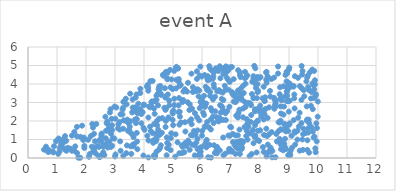
| Category | Series 0 |
|---|---|
| 6.514540313641692 | 0.25 |
| 3.258036223303853 | 2.355 |
| 9.611685176595932 | 2.788 |
| 6.718119250185469 | 2.056 |
| 3.560900860458809 | 0.226 |
| 9.434667183937016 | 4.973 |
| 9.293604395264447 | 1.469 |
| 2.3106375163464357 | 0.904 |
| 9.527382701474306 | 3.335 |
| 8.726764199824812 | 0.893 |
| 5.825327841776408 | 4.685 |
| 1000.0 | 1000 |
| 1000.0 | 1000 |
| 1000.0 | 1000 |
| 2.7900266712365154 | 1.78 |
| 7.911885719242525 | 3.995 |
| 5.846657293763941 | 3.717 |
| 7.2453509117797 | 2.362 |
| 2.072651007675997 | 0.986 |
| 7.290248872529956 | 2.613 |
| 3.8726823225385285 | 2.642 |
| 1000.0 | 1000 |
| 4.938799020726297 | 1.337 |
| 1.2728139878986489 | 0.508 |
| 7.4158468451568815 | 2.201 |
| 1000.0 | 1000 |
| 9.66142939396353 | 1.606 |
| 9.600120747328019 | 4.144 |
| 4.246755495161998 | 2.842 |
| 4.922787181447119 | 1.071 |
| 4.590618096940318 | 3.41 |
| 6.416403614070068 | 3.818 |
| 5.556336335870954 | 0.84 |
| 1000.0 | 1000 |
| 1000.0 | 1000 |
| 1000.0 | 1000 |
| 1000.0 | 1000 |
| 9.04494552154286 | 0.16 |
| 4.452664086378109 | 1.772 |
| 6.681659004231962 | 3.192 |
| 5.825778668973726 | 4.275 |
| 6.379328122886779 | 3.17 |
| 1000.0 | 1000 |
| 0.6876049098019399 | 0.331 |
| 1000.0 | 1000 |
| 3.871232251648208 | 3.512 |
| 1000.0 | 1000 |
| 3.775248777607053 | 2.42 |
| 4.660409793697826 | 4.506 |
| 1000.0 | 1000 |
| 1000.0 | 1000 |
| 7.1762036709917805 | 0.581 |
| 2.9810257942731 | 1.051 |
| 1000.0 | 1000 |
| 5.003178958912086 | 1.778 |
| 7.9161145641658335 | 1.989 |
| 5.619706045245647 | 1.236 |
| 1000.0 | 1000 |
| 8.925193801852668 | 3.833 |
| 1000.0 | 1000 |
| 5.013668524437431 | 2.569 |
| 1000.0 | 1000 |
| 7.758082436355092 | 1.512 |
| 1000.0 | 1000 |
| 3.541358059265891 | 0.631 |
| 7.892898900187163 | 3.235 |
| 1000.0 | 1000 |
| 8.896641847217783 | 0.48 |
| 3.9532553654040594 | 2.474 |
| 6.966066409401218 | 1.207 |
| 1000.0 | 1000 |
| 6.808218139456765 | 0.241 |
| 9.623420101642365 | 2.072 |
| 4.429543796718467 | 3.363 |
| 1000.0 | 1000 |
| 8.871622594810644 | 3.341 |
| 1000.0 | 1000 |
| 8.632051306754953 | 1.442 |
| 7.502352511373928 | 2.76 |
| 1000.0 | 1000 |
| 6.634056661532679 | 4.312 |
| 1000.0 | 1000 |
| 3.740877927754135 | 3.434 |
| 5.686220917137559 | 3.568 |
| 3.3809819670199937 | 2.001 |
| 9.8960376760196 | 3.979 |
| 1000.0 | 1000 |
| 8.228029484336398 | 0.088 |
| 1000.0 | 1000 |
| 5.685380858201006 | 3.83 |
| 2.1715633291461134 | 1.191 |
| 7.654770253525554 | 1.328 |
| 8.399872269272793 | 1.399 |
| 1000.0 | 1000 |
| 1000.0 | 1000 |
| 1.0608959885048153 | 1.024 |
| 6.711718383214096 | 3.533 |
| 2.454232472207053 | 0.958 |
| 1000.0 | 1000 |
| 1000.0 | 1000 |
| 6.588337880781211 | 3.66 |
| 3.653043263124766 | 0.73 |
| 9.686106286316482 | 3.676 |
| 8.85359167712618 | 1.797 |
| 1.9267528540206402 | 1.105 |
| 1000.0 | 1000 |
| 5.359114226030945 | 3.595 |
| 1000.0 | 1000 |
| 3.4679052299274113 | 1.873 |
| 6.1043733892131415 | 2.766 |
| 8.561822941673391 | 1.297 |
| 5.414003402297297 | 0.806 |
| 6.712299307437418 | 4.796 |
| 6.810480057490162 | 4.584 |
| 8.683702296176923 | 1.918 |
| 2.626913685242187 | 0.688 |
| 1000.0 | 1000 |
| 8.12736722713076 | 3.852 |
| 1000.0 | 1000 |
| 5.045221637019969 | 3.201 |
| 7.7156233174318825 | 0.215 |
| 5.240193843390656 | 2.237 |
| 9.691128857250453 | 0.289 |
| 2.6246427155748844 | 0.709 |
| 5.506216551615943 | 3.014 |
| 5.848012588612992 | 0.477 |
| 1000.0 | 1000 |
| 4.559511935105263 | 3.897 |
| 7.036706938964193 | 3.558 |
| 7.130024140764714 | 0.681 |
| 6.943980034351408 | 2.769 |
| 8.483028087952224 | 3.253 |
| 1000.0 | 1000 |
| 1000.0 | 1000 |
| 7.4375483032000735 | 3.512 |
| 8.507203204080842 | 3.145 |
| 1.3291151319703531 | 0.392 |
| 2.531101460166074 | 0.89 |
| 9.290065904599496 | 0.994 |
| 8.864440213556103 | 1.036 |
| 7.967733605172224 | 2.673 |
| 7.182201013032082 | 2.29 |
| 9.659340068282848 | 3.835 |
| 1000.0 | 1000 |
| 9.848716116556968 | 1.103 |
| 5.218818625873767 | 0.256 |
| 3.6867273387000665 | 2.078 |
| 1000.0 | 1000 |
| 7.465627525975101 | 1.674 |
| 1000.0 | 1000 |
| 2.129740435931937 | 0.217 |
| 8.998576381001227 | 4.791 |
| 4.867270504674572 | 3.106 |
| 2.983964614326701 | 2.781 |
| 7.093316455840945 | 4.264 |
| 6.3464652420747765 | 2.548 |
| 9.202016896984315 | 4.42 |
| 6.895471794531911 | 4.239 |
| 6.264222998689867 | 0.707 |
| 1000.0 | 1000 |
| 4.82044853488968 | 4.284 |
| 1.8028459880965542 | 0.014 |
| 7.85060531830029 | 4.259 |
| 4.3543954767927655 | 3.08 |
| 7.063594628770513 | 1.299 |
| 1000.0 | 1000 |
| 1000.0 | 1000 |
| 4.147813707292426 | 3.636 |
| 2.4776869820574277 | 0.047 |
| 5.806915966917377 | 0.843 |
| 9.823055023263779 | 1.429 |
| 8.936965084795968 | 4.582 |
| 4.380535839575199 | 0.068 |
| 1000.0 | 1000 |
| 7.914297933571 | 3.554 |
| 6.212698852102766 | 0.043 |
| 4.236206944368406 | 1.456 |
| 3.188035578879046 | 2.36 |
| 1000.0 | 1000 |
| 1000.0 | 1000 |
| 7.968309888299755 | 0.92 |
| 1000.0 | 1000 |
| 4.551455021510849 | 0.545 |
| 1000.0 | 1000 |
| 5.93566228334256 | 0.555 |
| 3.6305060942906775 | 0.738 |
| 7.5685874340832395 | 0.99 |
| 8.282125300683639 | 0.318 |
| 5.080129334359851 | 0.069 |
| 8.22695800207018 | 4.066 |
| 1000.0 | 1000 |
| 5.1900322604879765 | 2.839 |
| 9.183193680717087 | 3.431 |
| 5.044480115368461 | 2.855 |
| 2.8992486127065775 | 1.509 |
| 1.5979403462377006 | 0.397 |
| 1000.0 | 1000 |
| 1000.0 | 1000 |
| 7.030300307435878 | 4.919 |
| 5.776724905912203 | 1.266 |
| 4.680318558717148 | 4.443 |
| 1000.0 | 1000 |
| 1.0430371045711961 | 0.225 |
| 3.8637399333534272 | 2.529 |
| 3.6200438204071617 | 2.524 |
| 6.163536174882916 | 0.979 |
| 0.7144950208958001 | 0.436 |
| 9.625427176227253 | 4.348 |
| 6.41934125486266 | 4.649 |
| 1000.0 | 1000 |
| 5.485324604742309 | 3.588 |
| 1000.0 | 1000 |
| 6.823739761555845 | 4.953 |
| 6.719900862978956 | 2.555 |
| 6.399390012197944 | 1.888 |
| 1000.0 | 1000 |
| 4.41154532265295 | 0.905 |
| 6.391364944535076 | 4.423 |
| 5.955075213295808 | 0.116 |
| 9.02473897776195 | 0.224 |
| 1000.0 | 1000 |
| 8.137386755633694 | 2.599 |
| 5.9567739569855895 | 0.341 |
| 1000.0 | 1000 |
| 1000.0 | 1000 |
| 6.270906933123551 | 4.242 |
| 5.845889803515922 | 1.494 |
| 8.241404398006035 | 1.191 |
| 9.95508216872793 | 0.897 |
| 1000.0 | 1000 |
| 7.095664108203753 | 3.046 |
| 1000.0 | 1000 |
| 2.6688865298084496 | 2.229 |
| 6.543294061614979 | 0.499 |
| 4.7025456202294835 | 2.718 |
| 5.301733448824302 | 0.682 |
| 7.247550160782171 | 4.747 |
| 7.545310348943461 | 2.097 |
| 7.307451780532784 | 0.218 |
| 7.332142571232993 | 4.371 |
| 1000.0 | 1000 |
| 6.143240497960162 | 2.944 |
| 0.8967386409265554 | 0.636 |
| 1000.0 | 1000 |
| 7.664707222498533 | 2.956 |
| 1000.0 | 1000 |
| 6.74054164617933 | 0.146 |
| 1000.0 | 1000 |
| 3.71327616995225 | 2.745 |
| 1000.0 | 1000 |
| 9.663890006803909 | 1.373 |
| 6.459865381903898 | 2.526 |
| 3.762144668001416 | 0.885 |
| 3.996319309304331 | 2.882 |
| 8.711038210874376 | 2.017 |
| 3.017206831126984 | 0.191 |
| 9.486145207419945 | 1.288 |
| 4.367661746456171 | 2.389 |
| 1000.0 | 1000 |
| 4.798404682042131 | 0.538 |
| 7.860147931615403 | 1.915 |
| 6.3816719039158905 | 2.241 |
| 4.877253682173817 | 2.851 |
| 2.33862078462149 | 0.24 |
| 3.724900766705128 | 2.085 |
| 6.2735918978225405 | 4.832 |
| 5.910648101177124 | 0.074 |
| 9.93043456170236 | 3.444 |
| 1000.0 | 1000 |
| 9.820999612242465 | 2.643 |
| 5.830470793768743 | 2.202 |
| 1000.0 | 1000 |
| 1000.0 | 1000 |
| 1000.0 | 1000 |
| 7.15447996717555 | 0.226 |
| 5.159745400582453 | 4.833 |
| 2.6915173147839666 | 1.474 |
| 1000.0 | 1000 |
| 8.34470673158056 | 3.625 |
| 6.94182275503053 | 0.347 |
| 4.821484832978177 | 3.435 |
| 5.523232727882823 | 0.945 |
| 9.893856861453509 | 4.202 |
| 5.208489437091116 | 3.242 |
| 1.2806991897897213 | 0.448 |
| 8.224242214543965 | 4.657 |
| 8.64163376453481 | 1.934 |
| 6.038383613097386 | 2.453 |
| 7.7927000005170335 | 4.23 |
| 1.150259706234692 | 0.75 |
| 1000.0 | 1000 |
| 4.302377585368769 | 1.344 |
| 6.631966731170321 | 3.592 |
| 9.679259066702755 | 2.075 |
| 1000.0 | 1000 |
| 3.7229447155647954 | 1.885 |
| 8.367000429181433 | 0.56 |
| 5.3321003032338705 | 0.599 |
| 1000.0 | 1000 |
| 7.332485757335206 | 0.931 |
| 5.7188539551587105 | 1.453 |
| 6.474273480099159 | 4.844 |
| 1000.0 | 1000 |
| 1000.0 | 1000 |
| 1000.0 | 1000 |
| 5.750110339120952 | 0.692 |
| 6.976334313948312 | 0.454 |
| 7.371194537192962 | 3.439 |
| 1000.0 | 1000 |
| 8.852529477733437 | 1.84 |
| 3.410123841095598 | 0.68 |
| 6.954289928328272 | 4.111 |
| 1000.0 | 1000 |
| 7.855765397749956 | 4.257 |
| 5.643888866368334 | 1.824 |
| 9.990744768019354 | 2.231 |
| 1.5128956668273696 | 1.208 |
| 1000.0 | 1000 |
| 1000.0 | 1000 |
| 5.921630233792862 | 2.695 |
| 1000.0 | 1000 |
| 1000.0 | 1000 |
| 4.484015765399862 | 2.846 |
| 1000.0 | 1000 |
| 7.776164515706685 | 0.798 |
| 9.19151780647466 | 1.434 |
| 1000.0 | 1000 |
| 4.801627071903875 | 0.823 |
| 9.848113686434678 | 3.927 |
| 9.632829366969023 | 0.435 |
| 9.193343354852173 | 2.681 |
| 4.545725821500337 | 1.291 |
| 9.36594439407828 | 2.445 |
| 5.266191773828888 | 3.949 |
| 7.838992140334514 | 1.197 |
| 1000.0 | 1000 |
| 9.61789981577809 | 2.019 |
| 8.261439886375273 | 4.416 |
| 7.802275845440008 | 4.978 |
| 8.810940513478846 | 2.344 |
| 1000.0 | 1000 |
| 1000.0 | 1000 |
| 5.8448672464615115 | 1.037 |
| 3.6238560780121643 | 0.637 |
| 8.83875381340874 | 0.773 |
| 4.911861901838694 | 3.816 |
| 3.4019592583251033 | 2.901 |
| 5.1930736472680685 | 2.48 |
| 1000.0 | 1000 |
| 8.003325289158044 | 2.466 |
| 1000.0 | 1000 |
| 5.222423120304373 | 3.892 |
| 4.3803315809945715 | 3.074 |
| 1000.0 | 1000 |
| 1000.0 | 1000 |
| 9.00954510703923 | 1.805 |
| 1000.0 | 1000 |
| 1000.0 | 1000 |
| 7.478890724353494 | 3.027 |
| 5.197220392025122 | 4.268 |
| 7.882079933877385 | 0.3 |
| 4.785195511697403 | 1.115 |
| 8.229990341659354 | 4.204 |
| 9.481755710453035 | 0.436 |
| 1000.0 | 1000 |
| 4.155163877615523 | 0.947 |
| 5.985117269969175 | 2.812 |
| 1000.0 | 1000 |
| 1000.0 | 1000 |
| 5.794371801498438 | 3.613 |
| 1000.0 | 1000 |
| 5.100461762520299 | 4.887 |
| 5.517294853772071 | 4.066 |
| 8.62337746160611 | 4.568 |
| 1000.0 | 1000 |
| 9.993747789134206 | 3.054 |
| 4.451363117371424 | 1.339 |
| 1.8653586643806797 | 1.746 |
| 1000.0 | 1000 |
| 1.597530083334503 | 1.411 |
| 2.9247422389931224 | 1.069 |
| 3.8044481382731243 | 2.935 |
| 1000.0 | 1000 |
| 2.8454326378790995 | 2.635 |
| 1000.0 | 1000 |
| 6.391924342224485 | 4.656 |
| 4.843147185309907 | 2.152 |
| 9.213663530744414 | 0.725 |
| 8.888515432361721 | 1.73 |
| 1000.0 | 1000 |
| 6.098486295088654 | 1.674 |
| 5.276805542338191 | 1.919 |
| 8.992293380357658 | 2.507 |
| 5.750902091777567 | 0.141 |
| 1000.0 | 1000 |
| 6.0017367785585085 | 1.211 |
| 1000.0 | 1000 |
| 1.5137523090646887 | 0.39 |
| 9.942339834454698 | 1.875 |
| 7.417022082745534 | 2.674 |
| 7.772842904376491 | 4.423 |
| 3.612112896544982 | 2.728 |
| 9.916404290672297 | 3.361 |
| 6.526206393716296 | 3.604 |
| 9.429583205640709 | 1.889 |
| 6.11024455491199 | 0.742 |
| 7.400770034237737 | 0.905 |
| 8.216943695766492 | 4.238 |
| 1000.0 | 1000 |
| 9.428145298580276 | 3.14 |
| 1000.0 | 1000 |
| 7.292869346962921 | 1.535 |
| 1.0953288674330153 | 0.547 |
| 1000.0 | 1000 |
| 4.524273077650355 | 2.13 |
| 6.120912075072845 | 1.736 |
| 9.18136628560243 | 3.23 |
| 2.532538135257576 | 1.252 |
| 1000.0 | 1000 |
| 6.251216382244198 | 4.964 |
| 9.159375376729873 | 2.045 |
| 1000.0 | 1000 |
| 7.92225473007978 | 2.654 |
| 4.94739304736599 | 4.246 |
| 5.883000750286059 | 3.33 |
| 3.1061163061557693 | 1.6 |
| 1000.0 | 1000 |
| 7.934239028134008 | 3.626 |
| 8.724029758113156 | 0.478 |
| 6.038238049857735 | 2.973 |
| 1.088255380925739 | 0.349 |
| 1000.0 | 1000 |
| 4.719760991873817 | 3.772 |
| 4.144153920804195 | 3.798 |
| 2.6332343460393837 | 0.161 |
| 1000.0 | 1000 |
| 2.198064178238086 | 0.611 |
| 2.246388612894501 | 0.353 |
| 4.526143397310761 | 1.238 |
| 7.370068755906996 | 3.161 |
| 7.5634819412285434 | 4.465 |
| 8.134913644347938 | 0.323 |
| 3.7513531518291154 | 1.356 |
| 7.153047281873003 | 1.221 |
| 2.438404582255579 | 0.086 |
| 5.102520807874495 | 3.76 |
| 8.676149734853674 | 1.033 |
| 9.160756959725987 | 3.895 |
| 7.77511674733937 | 3.234 |
| 7.3126028949046775 | 0.784 |
| 1000.0 | 1000 |
| 4.265516784529528 | 3.038 |
| 6.093954121144587 | 4.486 |
| 4.020414590051057 | 1.524 |
| 7.421340141562386 | 3.903 |
| 1000.0 | 1000 |
| 9.867915486132105 | 4.707 |
| 8.737187801379068 | 3.246 |
| 4.780560604598476 | 0.147 |
| 8.710846180635837 | 1.547 |
| 9.867204301409426 | 3.718 |
| 9.919052296363692 | 0.313 |
| 8.8899861854347 | 1.441 |
| 3.288723180164299 | 3.035 |
| 1000.0 | 1000 |
| 7.839313199469372 | 4.851 |
| 1000.0 | 1000 |
| 7.554513202457955 | 1.828 |
| 4.802460769707334 | 4.257 |
| 6.1501400984532815 | 0.573 |
| 1000.0 | 1000 |
| 3.9092159141230445 | 1.876 |
| 6.643729626311099 | 2.45 |
| 9.108035441854273 | 0.559 |
| 1000.0 | 1000 |
| 1000.0 | 1000 |
| 1000.0 | 1000 |
| 5.637234837005489 | 4.559 |
| 4.115149888418496 | 1.202 |
| 3.904265513414157 | 2.375 |
| 1000.0 | 1000 |
| 7.927140550005194 | 1.471 |
| 1.6882461532318405 | 1.172 |
| 1000.0 | 1000 |
| 3.1774048513833764 | 0.899 |
| 5.680638407100113 | 1.216 |
| 8.007058358184846 | 1.497 |
| 2.821650081287367 | 1.575 |
| 9.013965941736261 | 3.796 |
| 1000.0 | 1000 |
| 1000.0 | 1000 |
| 3.440544034466264 | 1.473 |
| 8.127271047730495 | 2.081 |
| 7.050854723961548 | 3.464 |
| 2.4452055976173384 | 0.598 |
| 1000.0 | 1000 |
| 1.687693211754655 | 1.682 |
| 2.5954215763514465 | 0.313 |
| 4.297942774185888 | 4.167 |
| 7.257058687233062 | 3.198 |
| 1000.0 | 1000 |
| 9.154460827792217 | 3.856 |
| 6.1275117351814155 | 3.851 |
| 7.916547724499319 | 2.017 |
| 8.15694660148163 | 3.096 |
| 1.054581208178751 | 1.054 |
| 1000.0 | 1000 |
| 1000.0 | 1000 |
| 1000.0 | 1000 |
| 5.3915856327208855 | 0.311 |
| 8.17915523314131 | 3.281 |
| 8.357384106579417 | 3.321 |
| 1000.0 | 1000 |
| 7.47637359773273 | 4.313 |
| 5.1747036016131425 | 4.851 |
| 1000.0 | 1000 |
| 1000.0 | 1000 |
| 2.597298058036296 | 0.611 |
| 6.17298411321083 | 3.688 |
| 8.827103444167498 | 2.78 |
| 7.676310559929539 | 1.952 |
| 7.046942656077171 | 0.349 |
| 2.824344023949755 | 2.46 |
| 1000.0 | 1000 |
| 8.878514706045483 | 4.487 |
| 1000.0 | 1000 |
| 7.691048578308904 | 2.857 |
| 1000.0 | 1000 |
| 8.983642249820438 | 3.938 |
| 1000.0 | 1000 |
| 1000.0 | 1000 |
| 9.78054165765431 | 3.567 |
| 5.944020921533207 | 4.938 |
| 2.6822679117858215 | 1.065 |
| 1000.0 | 1000 |
| 8.622986786106614 | 4.945 |
| 7.80406731158709 | 1.223 |
| 4.4335068783290845 | 3.145 |
| 7.069715247301182 | 0.86 |
| 4.897193608231383 | 4.761 |
| 1.3716063337318107 | 0.551 |
| 2.896559774070766 | 1.769 |
| 9.77281777683055 | 1.666 |
| 1000.0 | 1000 |
| 1.2015805747819408 | 0.821 |
| 0.7251526458453283 | 0.34 |
| 3.278483962989942 | 1.583 |
| 1000.0 | 1000 |
| 7.104886741576245 | 3.361 |
| 3.599689196227027 | 1.27 |
| 8.936970624167206 | 3.363 |
| 2.516317137283044 | 0.14 |
| 8.754617009828978 | 3.125 |
| 9.962423243946368 | 1.62 |
| 1000.0 | 1000 |
| 1000.0 | 1000 |
| 5.1964486822132905 | 4.126 |
| 1000.0 | 1000 |
| 6.942456178845146 | 4.901 |
| 1000.0 | 1000 |
| 3.9798703453791417 | 0.133 |
| 0.9660386035829827 | 0.912 |
| 7.502330038892256 | 4.02 |
| 8.308420594798077 | 1.276 |
| 3.5079063406498134 | 1.693 |
| 9.018772905660684 | 1.867 |
| 3.1619149634159083 | 1.534 |
| 6.312114971423158 | 2.098 |
| 3.280406114727522 | 2.72 |
| 1000.0 | 1000 |
| 8.725150761304116 | 2.404 |
| 8.53397491995067 | 0.042 |
| 2.682491367872487 | 0.724 |
| 6.1808956522292835 | 1.954 |
| 5.322760270980663 | 3.021 |
| 1000.0 | 1000 |
| 3.1165925537688413 | 1.824 |
| 1000.0 | 1000 |
| 1000.0 | 1000 |
| 1.2250107634709406 | 1.02 |
| 8.041386333667749 | 2.237 |
| 3.390713415885104 | 0.26 |
| 7.734720839643412 | 4.122 |
| 8.418015731024349 | 0.036 |
| 1000.0 | 1000 |
| 2.899280795165212 | 0.66 |
| 9.507949694965683 | 3.662 |
| 7.8114216232541365 | 1.146 |
| 1000.0 | 1000 |
| 4.130878318828178 | 3.954 |
| 1000.0 | 1000 |
| 1.3217792532368233 | 0.935 |
| 9.467254834272186 | 4.704 |
| 1000.0 | 1000 |
| 1000.0 | 1000 |
| 8.21763571661273 | 1.584 |
| 1000.0 | 1000 |
| 6.071367193300111 | 3.361 |
| 1000.0 | 1000 |
| 1000.0 | 1000 |
| 7.36543237538327 | 0.77 |
| 4.219156771503924 | 4.152 |
| 1000.0 | 1000 |
| 1000.0 | 1000 |
| 6.278818826990794 | 3.565 |
| 8.511790731888624 | 2.802 |
| 6.736240565278764 | 3.136 |
| 6.735387349953658 | 4.549 |
| 4.51985820162582 | 0.457 |
| 3.424918445262052 | 2.076 |
| 6.4043073011317215 | 3.984 |
| 6.808718535505652 | 2.415 |
| 1000.0 | 1000 |
| 1000.0 | 1000 |
| 1000.0 | 1000 |
| 1.4618874641865498 | 0.508 |
| 3.155100237645688 | 1.945 |
| 5.99228549044994 | 3.095 |
| 4.265277050702652 | 3.048 |
| 4.343702950169841 | 2.675 |
| 1000.0 | 1000 |
| 8.525450982408344 | 2.874 |
| 8.486445952752407 | 4.346 |
| 4.431500383402095 | 1.134 |
| 1000.0 | 1000 |
| 8.01707889082486 | 4.371 |
| 1000.0 | 1000 |
| 4.767148171856536 | 3.356 |
| 6.178848330868765 | 4.381 |
| 7.261568749988988 | 2.459 |
| 5.950805441243966 | 3.028 |
| 7.243076325835797 | 3.654 |
| 1000.0 | 1000 |
| 8.202732257817912 | 2.659 |
| 8.55145859633141 | 2.805 |
| 3.0119091686193444 | 2.123 |
| 6.934930476555819 | 0.488 |
| 6.3758467350532255 | 4.291 |
| 1000.0 | 1000 |
| 8.690155317892431 | 3.179 |
| 1.2776679312092043 | 1.185 |
| 1000.0 | 1000 |
| 9.341803686933774 | 1.705 |
| 6.327221264605183 | 4.742 |
| 4.735293749918039 | 3.266 |
| 6.18573621642872 | 4.278 |
| 1000.0 | 1000 |
| 1000.0 | 1000 |
| 6.564780814035361 | 4.705 |
| 1000.0 | 1000 |
| 6.198824408056293 | 3.74 |
| 1000.0 | 1000 |
| 8.91764020253578 | 4.658 |
| 1000.0 | 1000 |
| 1000.0 | 1000 |
| 6.548526706327655 | 2.014 |
| 1000.0 | 1000 |
| 8.929047591337905 | 3.069 |
| 5.575463459810678 | 0.443 |
| 7.829388738337762 | 1.772 |
| 8.540047899363742 | 2.964 |
| 1000.0 | 1000 |
| 1000.0 | 1000 |
| 3.1925574937417633 | 0.392 |
| 1000.0 | 1000 |
| 8.268944004948876 | 0.726 |
| 6.498592351282191 | 2.209 |
| 5.991132148282608 | 3.067 |
| 9.453069308739746 | 4.507 |
| 6.6049024597498915 | 2.167 |
| 9.054321635756459 | 0.392 |
| 9.37422311068177 | 3.884 |
| 3.874195991975612 | 3.743 |
| 8.391982187075701 | 4.268 |
| 3.7721865942335486 | 0.475 |
| 7.206517659598356 | 0.873 |
| 7.722467345942833 | 3.455 |
| 1.6291896748399315 | 0.627 |
| 8.716609583351305 | 0.732 |
| 1000.0 | 1000 |
| 4.984037351971432 | 2.49 |
| 9.566306289297874 | 1.35 |
| 3.0473616074413066 | 2.731 |
| 1000.0 | 1000 |
| 8.1560547864761 | 2.37 |
| 6.145620844729197 | 0.904 |
| 8.161477494597392 | 3.075 |
| 5.65538656128239 | 2.663 |
| 7.856128505160251 | 3.979 |
| 9.907310824536097 | 0.522 |
| 2.7474046613377556 | 0.569 |
| 1000.0 | 1000 |
| 5.352932503288192 | 3.133 |
| 4.382705970198187 | 0.108 |
| 1000.0 | 1000 |
| 4.854622555248947 | 0.718 |
| 8.972024956205399 | 0.157 |
| 8.426601193057254 | 0.382 |
| 4.152606426072101 | 0.032 |
| 5.08919164055384 | 1.278 |
| 2.2166363081580345 | 1.834 |
| 5.981941813902054 | 0.585 |
| 8.583877053711856 | 0.893 |
| 1000.0 | 1000 |
| 4.629437243666574 | 2.158 |
| 5.5701004166210675 | 1.99 |
| 1.1521040712186592 | 0.626 |
| 1000.0 | 1000 |
| 6.954050867884462 | 0.45 |
| 4.916935700312957 | 0.424 |
| 2.791933279849909 | 1.626 |
| 6.310187191917924 | 0.022 |
| 3.7242999268256325 | 2.593 |
| 4.432493904740429 | 1.003 |
| 6.5862507471596645 | 3.654 |
| 1000.0 | 1000 |
| 1000.0 | 1000 |
| 8.355829781408842 | 0.337 |
| 3.490596876050099 | 1.504 |
| 1000.0 | 1000 |
| 2.3565842520341196 | 1.838 |
| 8.362298746677912 | 0.494 |
| 0.8547532980838979 | 0.348 |
| 9.856878002590083 | 3.248 |
| 0.5519415893125423 | 0.45 |
| 1000.0 | 1000 |
| 1000.0 | 1000 |
| 4.316987425429458 | 0.82 |
| 4.5222257413122335 | 3.859 |
| 5.120980375537943 | 4.928 |
| 9.635232141225178 | 0.956 |
| 5.6681402858199625 | 0.72 |
| 9.310776378835946 | 4.334 |
| 8.007651824855671 | 2.828 |
| 2.5087956601759043 | 0.984 |
| 4.451884937829274 | 2.01 |
| 8.212556786803724 | 4.623 |
| 8.4957472356412 | 2.662 |
| 1000.0 | 1000 |
| 6.730064695917775 | 4.843 |
| 1000.0 | 1000 |
| 3.5332530279836094 | 1.373 |
| 1000.0 | 1000 |
| 7.482054279019778 | 4.657 |
| 1000.0 | 1000 |
| 6.805585638891754 | 3.673 |
| 1000.0 | 1000 |
| 8.971786866779706 | 1.457 |
| 3.7471096197852463 | 2.472 |
| 5.426669146513717 | 1.431 |
| 1000.0 | 1000 |
| 1000.0 | 1000 |
| 8.689434993447826 | 3.824 |
| 9.647979130115157 | 4.451 |
| 1000.0 | 1000 |
| 4.993731806904248 | 2.404 |
| 3.992464528655264 | 2.859 |
| 3.7138738597857435 | 3.264 |
| 5.155767942085862 | 0.846 |
| 3.2970919464632176 | 2.035 |
| 9.757473290920668 | 3.219 |
| 9.025430459828357 | 3.095 |
| 1000.0 | 1000 |
| 6.611982034902782 | 4.959 |
| 6.703507251027297 | 2.738 |
| 9.801805853495985 | 4.779 |
| 2.539954810775619 | 1.323 |
| 2.886425311817946 | 2.113 |
| 2.763769228719469 | 1.474 |
| 1000.0 | 1000 |
| 1.149476084775215 | 0.792 |
| 7.409211108043317 | 0.84 |
| 9.316080187847259 | 2.176 |
| 7.825470359145808 | 2.632 |
| 1000.0 | 1000 |
| 5.992535690234776 | 3.217 |
| 5.628213608739475 | 2.09 |
| 9.43812578433253 | 3.776 |
| 7.110942404438107 | 3.469 |
| 9.460386383146911 | 1.001 |
| 8.093899203369666 | 3.229 |
| 7.307884530657962 | 4.481 |
| 6.008752859683733 | 3.058 |
| 6.304075214794757 | 2.694 |
| 1000.0 | 1000 |
| 1000.0 | 1000 |
| 1000.0 | 1000 |
| 2.7096874639026147 | 1.882 |
| 1000.0 | 1000 |
| 6.305208568145187 | 1.54 |
| 1000.0 | 1000 |
| 1.9043262823922336 | 0.971 |
| 8.809108959346824 | 3.875 |
| 4.534386854120016 | 3.669 |
| 1.7352625713551695 | 0.016 |
| 1000.0 | 1000 |
| 7.384075762877592 | 0.565 |
| 7.5440612208092395 | 1.463 |
| 1000.0 | 1000 |
| 2.2766549061683983 | 1.307 |
| 1000.0 | 1000 |
| 3.9266435470146765 | 2.445 |
| 1000.0 | 1000 |
| 1000.0 | 1000 |
| 1000.0 | 1000 |
| 5.90593877439038 | 0.205 |
| 3.9840106893037808 | 1.63 |
| 4.755740248500459 | 4.652 |
| 6.578545559934898 | 1.977 |
| 7.526983737440637 | 1.19 |
| 8.930865210466147 | 3.587 |
| 7.235334532417696 | 1.221 |
| 8.678908879466702 | 3.447 |
| 6.854963820833926 | 4.34 |
| 1000.0 | 1000 |
| 6.821398582878574 | 2.052 |
| 9.010966805417613 | 4.884 |
| 2.413224197658721 | 0.659 |
| 1000.0 | 1000 |
| 6.518481788467549 | 0.601 |
| 1000.0 | 1000 |
| 1.9434185305331686 | 0.543 |
| 5.112630283270848 | 4.229 |
| 4.740304534691921 | 2.6 |
| 5.901355650361872 | 2.032 |
| 7.978100891473888 | 4.319 |
| 8.925068816136516 | 3.606 |
| 7.6014916662208885 | 1.688 |
| 4.4301853612399515 | 0.342 |
| 1.6931506262485307 | 0.266 |
| 1000.0 | 1000 |
| 3.6067425224726812 | 3.166 |
| 5.9048551816374975 | 3.645 |
| 1.813259330198076 | 1.144 |
| 2.9998759171928704 | 0.078 |
| 8.102485629932588 | 0.588 |
| 6.866196187750302 | 2.533 |
| 8.263303047134977 | 2.164 |
| 5.2178777149435955 | 1.801 |
| 7.306205770342452 | 4.635 |
| 9.369467939242384 | 0.397 |
| 5.566739247624523 | 2.592 |
| 1000.0 | 1000 |
| 4.3562609945544075 | 0.056 |
| 1000.0 | 1000 |
| 7.908423105962035 | 0.975 |
| 7.8279489619899065 | 2.525 |
| 4.171545167354653 | 2.783 |
| 3.5233351669387734 | 3.477 |
| 6.787249138970413 | 3.9 |
| 6.416400922083481 | 0.688 |
| 5.988149949427404 | 4.401 |
| 4.985903497021886 | 2.064 |
| 8.317199547751132 | 2.74 |
| 3.3203624595187167 | 3.072 |
| 9.026728064756632 | 4.02 |
| 9.69587240965707 | 1.883 |
| 3.530413841500246 | 1.982 |
| 3.285963612064201 | 0.113 |
| 4.470298021881993 | 3.471 |
| 1000.0 | 1000 |
| 6.070524220935924 | 2.327 |
| 2.5339378145882216 | 1.172 |
| 4.097275927646608 | 3.865 |
| 9.876933753105213 | 1.158 |
| 1000.0 | 1000 |
| 7.594642581652237 | 2.98 |
| 5.4099405432121035 | 3.717 |
| 9.0912453097083 | 1.2 |
| 5.7568038356696905 | 2.422 |
| 7.908691088395924 | 4.382 |
| 5.577688473287723 | 2.899 |
| 1000.0 | 1000 |
| 6.23908781487997 | 1.659 |
| 2.807060847088273 | 0.884 |
| 5.918528238082249 | 4.46 |
| 3.752522359769457 | 2.103 |
| 6.892557455211177 | 4.712 |
| 4.984629806248154 | 3.725 |
| 8.715170640554511 | 2.791 |
| 7.697061259399973 | 2.321 |
| 9.757542769323228 | 2.82 |
| 4.212792719690942 | 2.737 |
| 2.8641099073772125 | 1.307 |
| 1000.0 | 1000 |
| 9.498798517983829 | 1.588 |
| 5.230409659853432 | 2.499 |
| 1000.0 | 1000 |
| 7.781129565788846 | 3.25 |
| 6.202336412742663 | 4.202 |
| 7.0061929337511355 | 1.663 |
| 8.855496114229508 | 0.602 |
| 7.251817185441817 | 0.496 |
| 1000.0 | 1000 |
| 1000.0 | 1000 |
| 1000.0 | 1000 |
| 6.613120021191577 | 0.41 |
| 6.624876226588032 | 2.856 |
| 2.2833735061565843 | 0.582 |
| 6.974149451263376 | 1.684 |
| 1000.0 | 1000 |
| 1000.0 | 1000 |
| 4.658533541938573 | 4.478 |
| 7.192554731129794 | 3.265 |
| 1.942798942521794 | 0.654 |
| 6.451102612706635 | 3.312 |
| 4.805470778651454 | 4.591 |
| 5.3145388542960115 | 0.268 |
| 3.592471425308056 | 2.46 |
| 6.942116033246009 | 4.825 |
| 4.502939713919551 | 3.722 |
| 8.987990915024174 | 3.078 |
| 4.209414203383829 | 1.697 |
| 1000.0 | 1000 |
| 7.8616757828511385 | 3.787 |
| 5.467016645628233 | 0.653 |
| 7.640083742244067 | 0.101 |
| 1000.0 | 1000 |
| 2.7383279963843465 | 1.974 |
| 4.7436074349398405 | 1.678 |
| 8.97392452464122 | 4.059 |
| 4.8416489692396745 | 2.194 |
| 7.161859691947053 | 3.021 |
| 1000.0 | 1000 |
| 4.579831549681876 | 0.687 |
| 7.366707057407444 | 0.482 |
| 9.211975039847683 | 1.373 |
| 7.510587404175048 | 4.354 |
| 5.414718233686372 | 1.933 |
| 6.502238445822393 | 0.427 |
| 8.529792491125523 | 3.12 |
| 1000.0 | 1000 |
| 4.384633789313362 | 0.168 |
| 6.671258819637505 | 2.804 |
| 4.753856707921149 | 2.004 |
| 4.343248246434368 | 0.143 |
| 1000.0 | 1000 |
| 4.573452389496967 | 3.48 |
| 1000.0 | 1000 |
| 4.320674494109083 | 0.955 |
| 1000.0 | 1000 |
| 8.916196429359783 | 4.145 |
| 1000.0 | 1000 |
| 6.204712531948823 | 3.662 |
| 1000.0 | 1000 |
| 1000.0 | 1000 |
| 7.237936958462145 | 2.19 |
| 1000.0 | 1000 |
| 1000.0 | 1000 |
| 5.0430858720785485 | 4.71 |
| 0.6218152205667515 | 0.614 |
| 1000.0 | 1000 |
| 3.6400102654481357 | 1.129 |
| 2.102692288429042 | 0.064 |
| 1000.0 | 1000 |
| 1000.0 | 1000 |
| 4.350249285553579 | 1.838 |
| 6.9094694653185815 | 1.215 |
| 8.138881727852725 | 1.246 |
| 9.808150884221325 | 4.028 |
| 1000.0 | 1000 |
| 5.788417340746248 | 3.671 |
| 4.48790948272743 | 1.534 |
| 7.774605957428664 | 4.293 |
| 6.916584290336415 | 3.691 |
| 7.352336033218874 | 3.241 |
| 8.798917499944597 | 0.416 |
| 2.7194884309518774 | 0.799 |
| 8.742341915459818 | 1.538 |
| 1000.0 | 1000 |
| 7.2870344384331895 | 3.49 |
| 4.615609178654363 | 1.364 |
| 4.150182028655017 | 2.19 |
| 2.282304405410919 | 0.429 |
| 6.729685843083715 | 1.107 |
| 1000.0 | 1000 |
| 2.8542397718645462 | 0.588 |
| 9.716297418632053 | 4.625 |
| 1000.0 | 1000 |
| 1000.0 | 1000 |
| 1000.0 | 1000 |
| 8.904600350223044 | 1.657 |
| 1.2595909988578913 | 0.885 |
| 7.341698050148533 | 3.763 |
| 1000.0 | 1000 |
| 6.005971910252831 | 1.462 |
| 1000.0 | 1000 |
| 6.202368495800154 | 4.423 |
| 4.769777809906842 | 2.697 |
| 3.373338220576273 | 3.207 |
| 6.281419896452535 | 3.355 |
| 0.8710888329164657 | 0.304 |
| 3.2606991497352658 | 2.615 |
| 1000.0 | 1000 |
| 6.445593412872281 | 0.275 |
| 2.2423425607632286 | 1.643 |
| 1000.0 | 1000 |